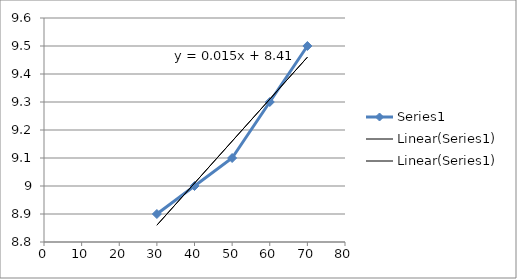
| Category | Series 0 |
|---|---|
| 30.0 | 8.9 |
| 40.0 | 9 |
| 50.0 | 9.1 |
| 60.0 | 9.3 |
| 70.0 | 9.5 |